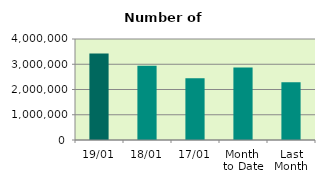
| Category | Series 0 |
|---|---|
| 19/01 | 3421220 |
| 18/01 | 2943434 |
| 17/01 | 2448718 |
| Month 
to Date | 2870518.923 |
| Last
Month | 2284008.087 |